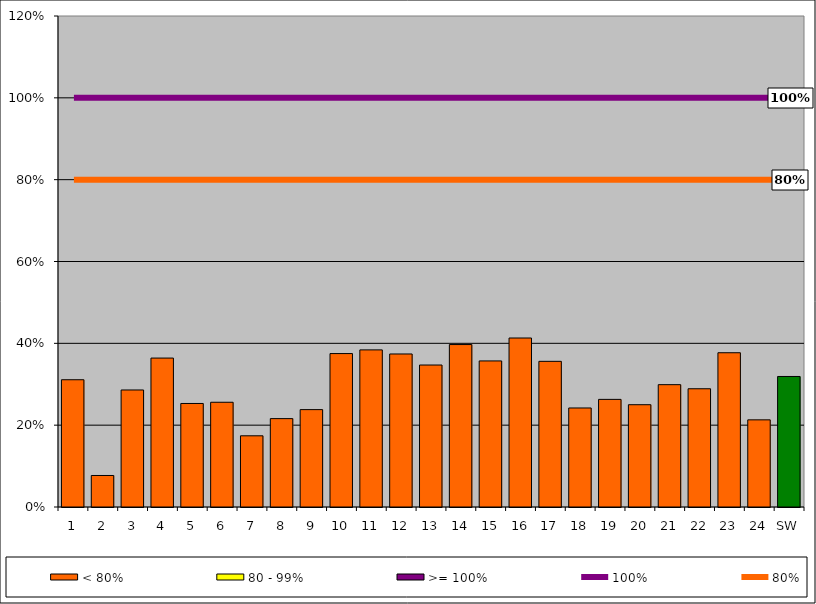
| Category | < 80% | 80 - 99% | >= 100% |
|---|---|---|---|
| 1 | 0.311 | 0 | 0 |
| 2 | 0.077 | 0 | 0 |
| 3 | 0.286 | 0 | 0 |
| 4 | 0.364 | 0 | 0 |
| 5 | 0.253 | 0 | 0 |
| 6 | 0.256 | 0 | 0 |
| 7 | 0.174 | 0 | 0 |
| 8 | 0.216 | 0 | 0 |
| 9 | 0.238 | 0 | 0 |
| 10 | 0.375 | 0 | 0 |
| 11 | 0.384 | 0 | 0 |
| 12 | 0.374 | 0 | 0 |
| 13 | 0.347 | 0 | 0 |
| 14 | 0.397 | 0 | 0 |
| 15 | 0.357 | 0 | 0 |
| 16 | 0.413 | 0 | 0 |
| 17 | 0.356 | 0 | 0 |
| 18 | 0.242 | 0 | 0 |
| 19 | 0.263 | 0 | 0 |
| 20 | 0.25 | 0 | 0 |
| 21 | 0.299 | 0 | 0 |
| 22 | 0.289 | 0 | 0 |
| 23 | 0.377 | 0 | 0 |
| 24 | 0.213 | 0 | 0 |
| SW | 0.319 | 0 | 0 |